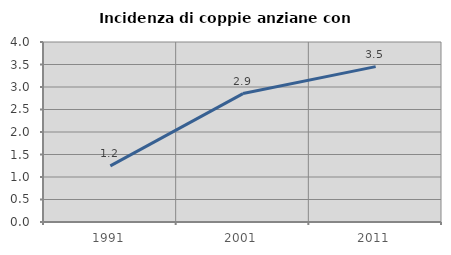
| Category | Incidenza di coppie anziane con figli |
|---|---|
| 1991.0 | 1.246 |
| 2001.0 | 2.854 |
| 2011.0 | 3.453 |